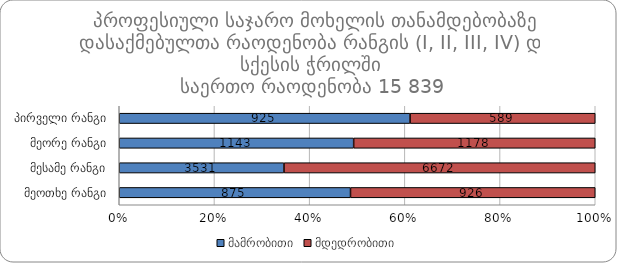
| Category | მამრობითი | მდედრობითი |
|---|---|---|
|  პირველი რანგი | 925 | 589 |
|  მეორე რანგი | 1143 | 1178 |
|  მესამე რანგი | 3531 | 6672 |
|  მეოთხე რანგი | 875 | 926 |